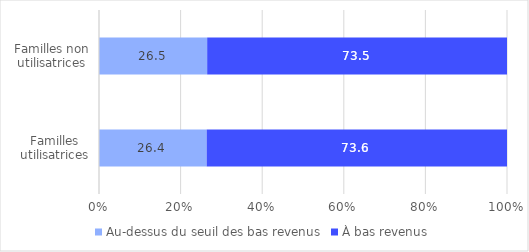
| Category | Au-dessus du seuil des bas revenus | À bas revenus |
|---|---|---|
| Familles utilisatrices | 26.388 | 73.612 |
| Familles non utilisatrices | 26.512 | 73.488 |